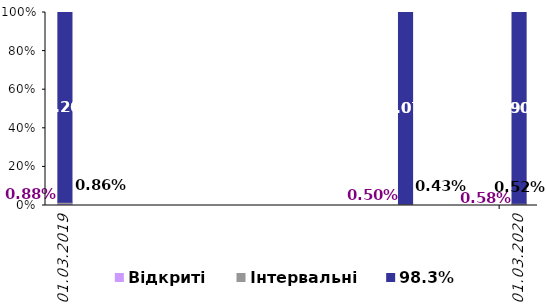
| Category | Відкриті | Інтервальні | 98,3% |
|---|---|---|---|
| 2019-03-31 | 0.009 | 0.009 | 0.983 |
| 2019-12-31 | 0.005 | 0.004 | 0.991 |
| 2020-03-31 | 0.006 | 0.005 | 0.989 |